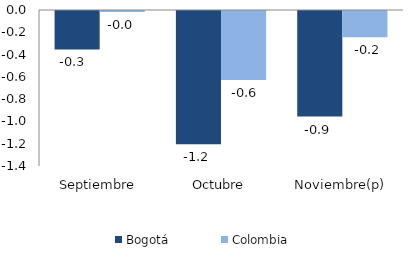
| Category | Bogotá | Colombia |
|---|---|---|
| Septiembre | -0.345 | -0.009 |
| Octubre | -1.195 | -0.62 |
| Noviembre(p) | -0.947 | -0.235 |